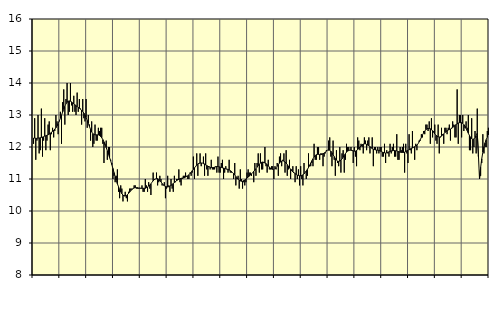
| Category | Handel, SNI 45-47 | Series 1 |
|---|---|---|
| nan | 12.1 | 12.28 |
| 87.0 | 12.9 | 12.28 |
| 87.0 | 11.6 | 12.27 |
| 87.0 | 12.2 | 12.27 |
| 87.0 | 13 | 12.28 |
| 87.0 | 11.8 | 12.28 |
| 87.0 | 11.9 | 12.29 |
| 87.0 | 13.2 | 12.3 |
| 87.0 | 11.7 | 12.31 |
| 87.0 | 12.2 | 12.32 |
| 87.0 | 12.9 | 12.34 |
| 87.0 | 11.9 | 12.35 |
| nan | 12.2 | 12.37 |
| 88.0 | 12.7 | 12.38 |
| 88.0 | 12.8 | 12.4 |
| 88.0 | 11.9 | 12.43 |
| 88.0 | 12.4 | 12.46 |
| 88.0 | 12.6 | 12.49 |
| 88.0 | 12.3 | 12.52 |
| 88.0 | 12.5 | 12.56 |
| 88.0 | 13 | 12.6 |
| 88.0 | 12.8 | 12.66 |
| 88.0 | 12.4 | 12.73 |
| 88.0 | 12.8 | 12.81 |
| nan | 13.1 | 12.9 |
| 89.0 | 12.1 | 12.99 |
| 89.0 | 13.4 | 13.09 |
| 89.0 | 13.8 | 13.18 |
| 89.0 | 12.7 | 13.27 |
| 89.0 | 13.5 | 13.35 |
| 89.0 | 14 | 13.4 |
| 89.0 | 13 | 13.43 |
| 89.0 | 13.1 | 13.44 |
| 89.0 | 14 | 13.43 |
| 89.0 | 13.3 | 13.41 |
| 89.0 | 13.1 | 13.38 |
| nan | 13.6 | 13.35 |
| 90.0 | 13.1 | 13.32 |
| 90.0 | 13 | 13.29 |
| 90.0 | 13.7 | 13.26 |
| 90.0 | 13.1 | 13.24 |
| 90.0 | 13.5 | 13.21 |
| 90.0 | 13.2 | 13.18 |
| 90.0 | 12.7 | 13.15 |
| 90.0 | 13.5 | 13.11 |
| 90.0 | 12.9 | 13.06 |
| 90.0 | 12.8 | 13 |
| 90.0 | 13.5 | 12.92 |
| nan | 12.6 | 12.83 |
| 91.0 | 13 | 12.74 |
| 91.0 | 12.7 | 12.64 |
| 91.0 | 12.2 | 12.55 |
| 91.0 | 12.8 | 12.47 |
| 91.0 | 12 | 12.42 |
| 91.0 | 12.1 | 12.39 |
| 91.0 | 12.7 | 12.38 |
| 91.0 | 12.2 | 12.38 |
| 91.0 | 12.2 | 12.38 |
| 91.0 | 12.6 | 12.38 |
| 91.0 | 12.5 | 12.36 |
| nan | 12.6 | 12.33 |
| 92.0 | 12.6 | 12.29 |
| 92.0 | 12.1 | 12.23 |
| 92.0 | 11.5 | 12.16 |
| 92.0 | 12.1 | 12.07 |
| 92.0 | 12.2 | 11.98 |
| 92.0 | 11.6 | 11.88 |
| 92.0 | 12 | 11.78 |
| 92.0 | 12 | 11.67 |
| 92.0 | 11.6 | 11.57 |
| 92.0 | 11.5 | 11.45 |
| 92.0 | 11 | 11.33 |
| nan | 11.1 | 11.2 |
| 93.0 | 10.9 | 11.08 |
| 93.0 | 11.1 | 10.96 |
| 93.0 | 11.3 | 10.85 |
| 93.0 | 10.6 | 10.76 |
| 93.0 | 10.4 | 10.67 |
| 93.0 | 10.8 | 10.6 |
| 93.0 | 10.7 | 10.54 |
| 93.0 | 10.3 | 10.5 |
| 93.0 | 10.5 | 10.47 |
| 93.0 | 10.6 | 10.47 |
| 93.0 | 10.4 | 10.48 |
| nan | 10.3 | 10.51 |
| 94.0 | 10.6 | 10.55 |
| 94.0 | 10.7 | 10.59 |
| 94.0 | 10.7 | 10.64 |
| 94.0 | 10.7 | 10.67 |
| 94.0 | 10.7 | 10.7 |
| 94.0 | 10.8 | 10.72 |
| 94.0 | 10.8 | 10.73 |
| 94.0 | 10.7 | 10.73 |
| 94.0 | 10.7 | 10.73 |
| 94.0 | 10.7 | 10.72 |
| 94.0 | 10.7 | 10.72 |
| nan | 10.7 | 10.71 |
| 95.0 | 10.8 | 10.71 |
| 95.0 | 10.6 | 10.71 |
| 95.0 | 10.6 | 10.71 |
| 95.0 | 11 | 10.71 |
| 95.0 | 10.8 | 10.73 |
| 95.0 | 10.6 | 10.75 |
| 95.0 | 10.9 | 10.78 |
| 95.0 | 10.7 | 10.81 |
| 95.0 | 10.5 | 10.85 |
| 95.0 | 10.9 | 10.9 |
| 95.0 | 11.2 | 10.94 |
| nan | 11 | 10.98 |
| 96.0 | 11 | 11 |
| 96.0 | 11.2 | 11.01 |
| 96.0 | 10.8 | 11.01 |
| 96.0 | 10.9 | 10.98 |
| 96.0 | 11.1 | 10.95 |
| 96.0 | 11 | 10.91 |
| 96.0 | 10.8 | 10.86 |
| 96.0 | 10.8 | 10.82 |
| 96.0 | 10.9 | 10.79 |
| 96.0 | 10.4 | 10.77 |
| 96.0 | 10.7 | 10.76 |
| nan | 11.1 | 10.75 |
| 97.0 | 10.8 | 10.76 |
| 97.0 | 10.6 | 10.78 |
| 97.0 | 11 | 10.8 |
| 97.0 | 10.7 | 10.83 |
| 97.0 | 10.6 | 10.86 |
| 97.0 | 11.1 | 10.89 |
| 97.0 | 10.9 | 10.92 |
| 97.0 | 11 | 10.95 |
| 97.0 | 11 | 10.97 |
| 97.0 | 11.3 | 10.99 |
| 97.0 | 10.9 | 11.01 |
| nan | 10.8 | 11.02 |
| 98.0 | 11 | 11.03 |
| 98.0 | 11.1 | 11.03 |
| 98.0 | 11.1 | 11.04 |
| 98.0 | 11.2 | 11.06 |
| 98.0 | 11.1 | 11.08 |
| 98.0 | 11 | 11.1 |
| 98.0 | 11 | 11.13 |
| 98.0 | 11.2 | 11.17 |
| 98.0 | 11.1 | 11.21 |
| 98.0 | 11.2 | 11.26 |
| 98.0 | 11.7 | 11.3 |
| nan | 11 | 11.35 |
| 99.0 | 11.4 | 11.39 |
| 99.0 | 11.8 | 11.44 |
| 99.0 | 11.1 | 11.47 |
| 99.0 | 11.5 | 11.49 |
| 99.0 | 11.8 | 11.5 |
| 99.0 | 11.4 | 11.5 |
| 99.0 | 11.5 | 11.5 |
| 99.0 | 11.7 | 11.48 |
| 99.0 | 11.1 | 11.47 |
| 99.0 | 11.8 | 11.44 |
| 99.0 | 11.3 | 11.42 |
| nan | 11.1 | 11.4 |
| 0.0 | 11.4 | 11.38 |
| 0.0 | 11.3 | 11.36 |
| 0.0 | 11.6 | 11.36 |
| 0.0 | 11.3 | 11.36 |
| 0.0 | 11.3 | 11.36 |
| 0.0 | 11.3 | 11.37 |
| 0.0 | 11.4 | 11.38 |
| 0.0 | 11.2 | 11.39 |
| 0.0 | 11.7 | 11.39 |
| 0.0 | 11.2 | 11.38 |
| 0.0 | 11.2 | 11.37 |
| nan | 11.5 | 11.36 |
| 1.0 | 11.6 | 11.35 |
| 1.0 | 11 | 11.34 |
| 1.0 | 11.2 | 11.33 |
| 1.0 | 11.4 | 11.32 |
| 1.0 | 11.3 | 11.31 |
| 1.0 | 11.2 | 11.3 |
| 1.0 | 11.6 | 11.28 |
| 1.0 | 11.2 | 11.26 |
| 1.0 | 11.2 | 11.24 |
| 1.0 | 11.2 | 11.2 |
| 1.0 | 11 | 11.17 |
| nan | 11.5 | 11.13 |
| 2.0 | 10.8 | 11.08 |
| 2.0 | 11 | 11.04 |
| 2.0 | 11.1 | 10.99 |
| 2.0 | 10.7 | 10.96 |
| 2.0 | 11.3 | 10.94 |
| 2.0 | 11 | 10.93 |
| 2.0 | 10.7 | 10.93 |
| 2.0 | 10.9 | 10.95 |
| 2.0 | 10.8 | 10.97 |
| 2.0 | 10.9 | 11 |
| 2.0 | 11.2 | 11.03 |
| nan | 11.3 | 11.06 |
| 3.0 | 11.2 | 11.09 |
| 3.0 | 11.2 | 11.12 |
| 3.0 | 11.1 | 11.16 |
| 3.0 | 11.2 | 11.2 |
| 3.0 | 10.9 | 11.24 |
| 3.0 | 11.5 | 11.28 |
| 3.0 | 11.1 | 11.32 |
| 3.0 | 11.5 | 11.37 |
| 3.0 | 11.8 | 11.42 |
| 3.0 | 11.2 | 11.46 |
| 3.0 | 11.8 | 11.5 |
| nan | 11.3 | 11.52 |
| 4.0 | 11.3 | 11.53 |
| 4.0 | 11.5 | 11.52 |
| 4.0 | 12 | 11.5 |
| 4.0 | 11.4 | 11.48 |
| 4.0 | 11.2 | 11.45 |
| 4.0 | 11.6 | 11.41 |
| 4.0 | 11.3 | 11.37 |
| 4.0 | 11.3 | 11.34 |
| 4.0 | 11.4 | 11.31 |
| 4.0 | 11.4 | 11.3 |
| 4.0 | 11 | 11.3 |
| nan | 11.4 | 11.32 |
| 5.0 | 11.3 | 11.35 |
| 5.0 | 11.5 | 11.4 |
| 5.0 | 11.1 | 11.45 |
| 5.0 | 11.7 | 11.5 |
| 5.0 | 11.8 | 11.53 |
| 5.0 | 11.4 | 11.56 |
| 5.0 | 11.6 | 11.57 |
| 5.0 | 11.8 | 11.56 |
| 5.0 | 11.2 | 11.53 |
| 5.0 | 11.9 | 11.5 |
| 5.0 | 11.1 | 11.45 |
| nan | 11.3 | 11.4 |
| 6.0 | 11.6 | 11.35 |
| 6.0 | 11 | 11.3 |
| 6.0 | 11.3 | 11.26 |
| 6.0 | 11.4 | 11.22 |
| 6.0 | 11.2 | 11.19 |
| 6.0 | 10.9 | 11.17 |
| 6.0 | 11.4 | 11.14 |
| 6.0 | 11 | 11.12 |
| 6.0 | 11.3 | 11.11 |
| 6.0 | 10.8 | 11.1 |
| 6.0 | 11.4 | 11.1 |
| nan | 11 | 11.11 |
| 7.0 | 10.8 | 11.13 |
| 7.0 | 11.5 | 11.16 |
| 7.0 | 11.2 | 11.2 |
| 7.0 | 11 | 11.25 |
| 7.0 | 11.1 | 11.3 |
| 7.0 | 11.8 | 11.36 |
| 7.0 | 11.4 | 11.43 |
| 7.0 | 11.4 | 11.5 |
| 7.0 | 11.5 | 11.57 |
| 7.0 | 11.4 | 11.63 |
| 7.0 | 12.1 | 11.69 |
| nan | 11.6 | 11.73 |
| 8.0 | 11.6 | 11.76 |
| 8.0 | 12 | 11.77 |
| 8.0 | 12 | 11.77 |
| 8.0 | 11.6 | 11.76 |
| 8.0 | 11.8 | 11.76 |
| 8.0 | 11.8 | 11.77 |
| 8.0 | 11.4 | 11.79 |
| 8.0 | 11.7 | 11.81 |
| 8.0 | 11.8 | 11.84 |
| 8.0 | 11.9 | 11.87 |
| 8.0 | 11.9 | 11.9 |
| nan | 12.2 | 11.9 |
| 9.0 | 12.3 | 11.9 |
| 9.0 | 11.7 | 11.87 |
| 9.0 | 11.4 | 11.82 |
| 9.0 | 12.2 | 11.76 |
| 9.0 | 11.6 | 11.7 |
| 9.0 | 11.1 | 11.64 |
| 9.0 | 11.9 | 11.59 |
| 9.0 | 11.5 | 11.56 |
| 9.0 | 11.4 | 11.55 |
| 9.0 | 12 | 11.56 |
| 9.0 | 11.2 | 11.59 |
| nan | 11.8 | 11.63 |
| 10.0 | 11.9 | 11.68 |
| 10.0 | 11.2 | 11.74 |
| 10.0 | 11.6 | 11.79 |
| 10.0 | 12.1 | 11.84 |
| 10.0 | 12 | 11.87 |
| 10.0 | 12 | 11.89 |
| 10.0 | 11.9 | 11.9 |
| 10.0 | 12 | 11.9 |
| 10.0 | 11.9 | 11.89 |
| 10.0 | 11.5 | 11.88 |
| 10.0 | 12 | 11.87 |
| nan | 11.7 | 11.87 |
| 11.0 | 11.4 | 11.89 |
| 11.0 | 12.3 | 11.92 |
| 11.0 | 12.2 | 11.95 |
| 11.0 | 11.9 | 12 |
| 11.0 | 12.1 | 12.03 |
| 11.0 | 12 | 12.07 |
| 11.0 | 11.8 | 12.09 |
| 11.0 | 12.3 | 12.1 |
| 11.0 | 12.2 | 12.1 |
| 11.0 | 11.9 | 12.08 |
| 11.0 | 12.2 | 12.06 |
| nan | 12.3 | 12.04 |
| 12.0 | 11.8 | 12.01 |
| 12.0 | 12 | 11.98 |
| 12.0 | 12.3 | 11.95 |
| 12.0 | 11.4 | 11.93 |
| 12.0 | 12 | 11.92 |
| 12.0 | 12 | 11.91 |
| 12.0 | 11.8 | 11.9 |
| 12.0 | 12 | 11.9 |
| 12.0 | 11.8 | 11.89 |
| 12.0 | 12 | 11.88 |
| 12.0 | 12 | 11.86 |
| nan | 11.7 | 11.84 |
| 13.0 | 11.7 | 11.83 |
| 13.0 | 12.1 | 11.82 |
| 13.0 | 11.5 | 11.81 |
| 13.0 | 11.9 | 11.82 |
| 13.0 | 11.8 | 11.83 |
| 13.0 | 11.7 | 11.85 |
| 13.0 | 12.1 | 11.86 |
| 13.0 | 11.8 | 11.88 |
| 13.0 | 12 | 11.88 |
| 13.0 | 12.1 | 11.89 |
| 13.0 | 11.7 | 11.89 |
| nan | 11.7 | 11.88 |
| 14.0 | 12.4 | 11.88 |
| 14.0 | 11.6 | 11.86 |
| 14.0 | 11.6 | 11.85 |
| 14.0 | 12 | 11.84 |
| 14.0 | 11.9 | 11.83 |
| 14.0 | 12 | 11.83 |
| 14.0 | 12.1 | 11.83 |
| 14.0 | 11.2 | 11.84 |
| 14.0 | 12.1 | 11.86 |
| 14.0 | 11.8 | 11.88 |
| 14.0 | 11.5 | 11.9 |
| nan | 12.4 | 11.92 |
| 15.0 | 11.9 | 11.94 |
| 15.0 | 11.8 | 11.96 |
| 15.0 | 12.5 | 11.97 |
| 15.0 | 12 | 11.99 |
| 15.0 | 11.6 | 12.01 |
| 15.0 | 12.1 | 12.03 |
| 15.0 | 11.9 | 12.06 |
| 15.0 | 12.1 | 12.1 |
| 15.0 | 12.2 | 12.16 |
| 15.0 | 12.2 | 12.23 |
| 15.0 | 12.4 | 12.3 |
| nan | 12.3 | 12.38 |
| 16.0 | 12.5 | 12.44 |
| 16.0 | 12.4 | 12.5 |
| 16.0 | 12.7 | 12.54 |
| 16.0 | 12.7 | 12.57 |
| 16.0 | 12.5 | 12.58 |
| 16.0 | 12.8 | 12.58 |
| 16.0 | 12.1 | 12.57 |
| 16.0 | 12.9 | 12.54 |
| 16.0 | 12.3 | 12.51 |
| 16.0 | 12.5 | 12.46 |
| 16.0 | 12.7 | 12.41 |
| nan | 12.2 | 12.37 |
| 17.0 | 12.1 | 12.34 |
| 17.0 | 12.7 | 12.32 |
| 17.0 | 11.8 | 12.31 |
| 17.0 | 12.3 | 12.32 |
| 17.0 | 12.6 | 12.34 |
| 17.0 | 12.4 | 12.37 |
| 17.0 | 12.1 | 12.41 |
| 17.0 | 12.6 | 12.45 |
| 17.0 | 12.6 | 12.48 |
| 17.0 | 12.4 | 12.51 |
| 17.0 | 12.6 | 12.53 |
| nan | 12.7 | 12.55 |
| 18.0 | 12.2 | 12.56 |
| 18.0 | 12.6 | 12.58 |
| 18.0 | 12.8 | 12.61 |
| 18.0 | 12.7 | 12.64 |
| 18.0 | 12.3 | 12.67 |
| 18.0 | 12.3 | 12.7 |
| 18.0 | 13.8 | 12.72 |
| 18.0 | 12.1 | 12.75 |
| 18.0 | 13 | 12.76 |
| 18.0 | 13 | 12.76 |
| 18.0 | 12.3 | 12.76 |
| nan | 13 | 12.74 |
| 19.0 | 12.5 | 12.7 |
| 19.0 | 12.6 | 12.65 |
| 19.0 | 12.8 | 12.58 |
| 19.0 | 12.6 | 12.51 |
| 19.0 | 13 | 12.43 |
| 19.0 | 11.9 | 12.36 |
| 19.0 | 11.9 | 12.3 |
| 19.0 | 12.9 | 12.26 |
| 19.0 | 11.8 | 12.24 |
| 19.0 | 12 | 12.25 |
| 19.0 | 12.5 | 12.29 |
| nan | 11.8 | 12.35 |
| 20.0 | 13.2 | 12.44 |
| 20.0 | 11.7 | 11.77 |
| 20.0 | 11.1 | 11 |
| 20.0 | 11.1 | 11.36 |
| 20.0 | 11.5 | 11.63 |
| 20.0 | 12.4 | 11.84 |
| 20.0 | 11.8 | 12 |
| 20.0 | 12 | 12.13 |
| 20.0 | 12 | 12.23 |
| 20.0 | 12.5 | 12.31 |
| 20.0 | 12.6 | 12.38 |